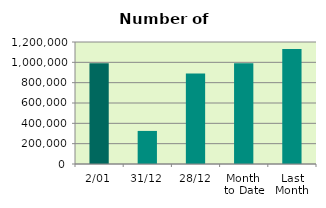
| Category | Series 0 |
|---|---|
| 2/01 | 991562 |
| 31/12 | 325352 |
| 28/12 | 890154 |
| Month 
to Date | 991562 |
| Last
Month | 1131500.526 |